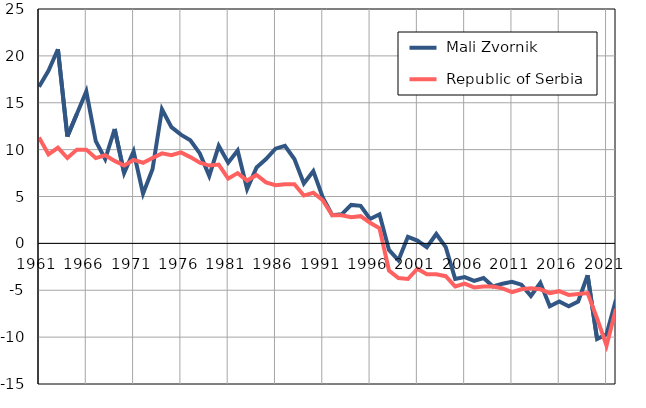
| Category |  Mali Zvornik |  Republic of Serbia |
|---|---|---|
| 1961.0 | 16.7 | 11.3 |
| 1962.0 | 18.4 | 9.5 |
| 1963.0 | 20.7 | 10.2 |
| 1964.0 | 11.4 | 9.1 |
| 1965.0 | 13.8 | 10 |
| 1966.0 | 16.2 | 10 |
| 1967.0 | 10.9 | 9.1 |
| 1968.0 | 9 | 9.4 |
| 1969.0 | 12.2 | 8.8 |
| 1970.0 | 7.5 | 8.3 |
| 1971.0 | 9.8 | 8.9 |
| 1972.0 | 5.3 | 8.6 |
| 1973.0 | 7.9 | 9.1 |
| 1974.0 | 14.3 | 9.6 |
| 1975.0 | 12.4 | 9.4 |
| 1976.0 | 11.6 | 9.7 |
| 1977.0 | 11 | 9.2 |
| 1978.0 | 9.6 | 8.6 |
| 1979.0 | 7.2 | 8.3 |
| 1980.0 | 10.4 | 8.4 |
| 1981.0 | 8.6 | 6.9 |
| 1982.0 | 9.9 | 7.5 |
| 1983.0 | 5.8 | 6.7 |
| 1984.0 | 8.1 | 7.3 |
| 1985.0 | 9 | 6.5 |
| 1986.0 | 10.1 | 6.2 |
| 1987.0 | 10.4 | 6.3 |
| 1988.0 | 9 | 6.3 |
| 1989.0 | 6.4 | 5.1 |
| 1990.0 | 7.7 | 5.4 |
| 1991.0 | 4.9 | 4.6 |
| 1992.0 | 3 | 3 |
| 1993.0 | 3.1 | 3 |
| 1994.0 | 4.1 | 2.8 |
| 1995.0 | 4 | 2.9 |
| 1996.0 | 2.6 | 2.2 |
| 1997.0 | 3.1 | 1.6 |
| 1998.0 | -0.7 | -2.9 |
| 1999.0 | -1.8 | -3.7 |
| 2000.0 | 0.7 | -3.8 |
| 2001.0 | 0.3 | -2.7 |
| 2002.0 | -0.4 | -3.3 |
| 2003.0 | 1 | -3.3 |
| 2004.0 | -0.4 | -3.5 |
| 2005.0 | -3.8 | -4.6 |
| 2006.0 | -3.6 | -4.3 |
| 2007.0 | -4 | -4.7 |
| 2008.0 | -3.7 | -4.6 |
| 2009.0 | -4.6 | -4.6 |
| 2010.0 | -4.3 | -4.8 |
| 2011.0 | -4.1 | -5.2 |
| 2012.0 | -4.4 | -4.9 |
| 2013.0 | -5.6 | -4.8 |
| 2014.0 | -4.2 | -4.9 |
| 2015.0 | -6.7 | -5.3 |
| 2016.0 | -6.2 | -5.1 |
| 2017.0 | -6.7 | -5.5 |
| 2018.0 | -6.2 | -5.4 |
| 2019.0 | -3.4 | -5.3 |
| 2020.0 | -10.2 | -8 |
| 2021.0 | -9.7 | -10.9 |
| 2022.0 | -6 | -7 |